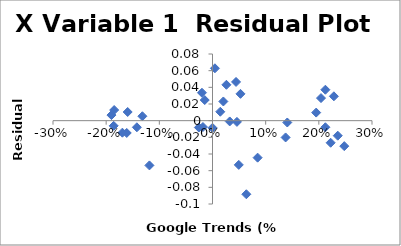
| Category | Series 0 |
|---|---|
| 0.140625 | -0.002 |
| 0.21232876712328763 | 0.037 |
| -0.11864406779661019 | -0.054 |
| -0.02564102564102566 | -0.008 |
| 0.052631578947368585 | 0.032 |
| 0.13749999999999996 | -0.02 |
| -0.13186813186813184 | 0.005 |
| 0.044303797468354444 | 0.046 |
| 0.08484848484848473 | -0.044 |
| 0.21229050279329598 | -0.008 |
| -0.16129032258064513 | -0.015 |
| 0.0494505494505495 | -0.053 |
| 0.02617801047120416 | 0.043 |
| 0.20408163265306145 | 0.027 |
| -0.16949152542372892 | -0.014 |
| 0.0 | -0.009 |
| 0.020408163265306367 | 0.023 |
| 0.19500000000000006 | 0.01 |
| -0.14225941422594157 | -0.008 |
| -0.014634146341463428 | 0.025 |
| -0.01980198019801971 | 0.034 |
| 0.22222222222222232 | -0.027 |
| -0.19008264462809932 | 0.007 |
| 0.04591836734693877 | -0.001 |
| 0.014634146341463428 | 0.011 |
| 0.23557692307692313 | -0.018 |
| -0.1595330739299612 | 0.01 |
| 0.03240740740740744 | -0.001 |
| -0.017937219730941645 | -0.008 |
| 0.22831050228310512 | 0.029 |
| -0.18587360594795543 | -0.006 |
| 0.004566210045662045 | 0.063 |
| 0.06363636363636371 | -0.088 |
| 0.24786324786324787 | -0.031 |
| -0.18493150684931503 | 0.013 |